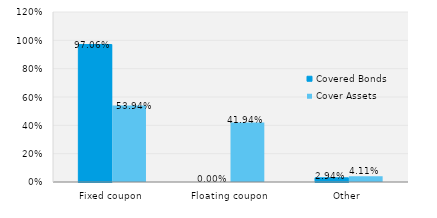
| Category | Covered Bonds | Cover Assets |
|---|---|---|
| Fixed coupon | 0.971 | 0.539 |
| Floating coupon | 0 | 0.419 |
| Other | 0.029 | 0.041 |